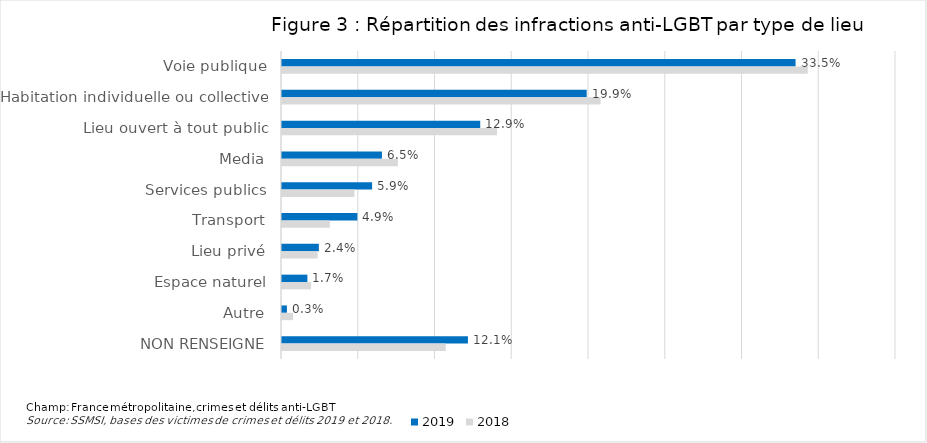
| Category | 2019 | 2018 |
|---|---|---|
| Voie publique | 0.335 | 0.343 |
| Habitation individuelle ou collective | 0.199 | 0.208 |
| Lieu ouvert à tout public | 0.129 | 0.14 |
| Media | 0.065 | 0.075 |
| Services publics | 0.059 | 0.047 |
| Transport | 0.049 | 0.031 |
| Lieu privé | 0.024 | 0.023 |
| Espace naturel | 0.017 | 0.019 |
| Autre | 0.003 | 0.007 |
| NON RENSEIGNE | 0.121 | 0.107 |